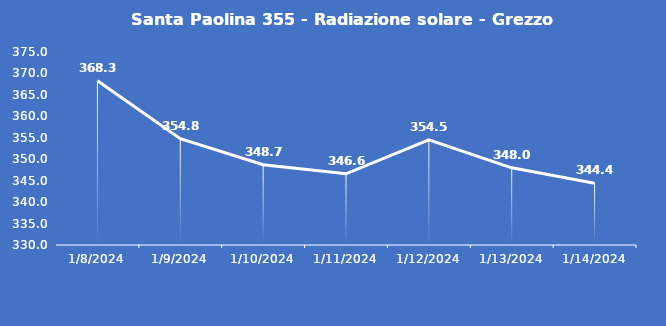
| Category | Santa Paolina 355 - Radiazione solare - Grezzo (W/m2) |
|---|---|
| 1/8/24 | 368.3 |
| 1/9/24 | 354.8 |
| 1/10/24 | 348.7 |
| 1/11/24 | 346.6 |
| 1/12/24 | 354.5 |
| 1/13/24 | 348 |
| 1/14/24 | 344.4 |